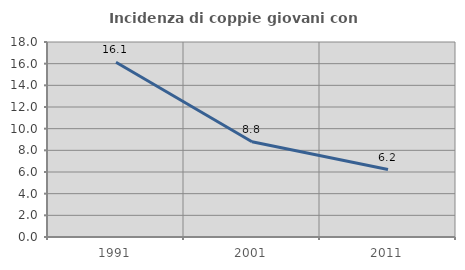
| Category | Incidenza di coppie giovani con figli |
|---|---|
| 1991.0 | 16.124 |
| 2001.0 | 8.788 |
| 2011.0 | 6.228 |